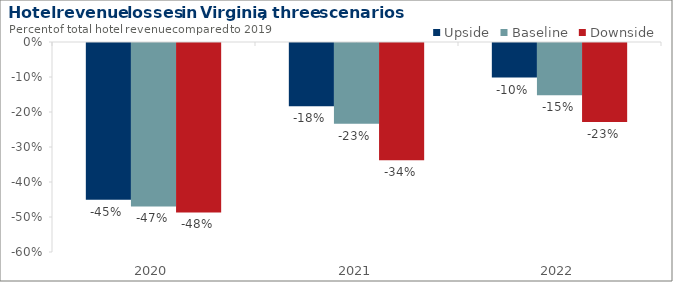
| Category | Upside | Baseline | Downside |
|---|---|---|---|
| 2020.0 | -0.448 | -0.467 | -0.484 |
| 2021.0 | -0.181 | -0.23 | -0.335 |
| 2022.0 | -0.099 | -0.149 | -0.226 |